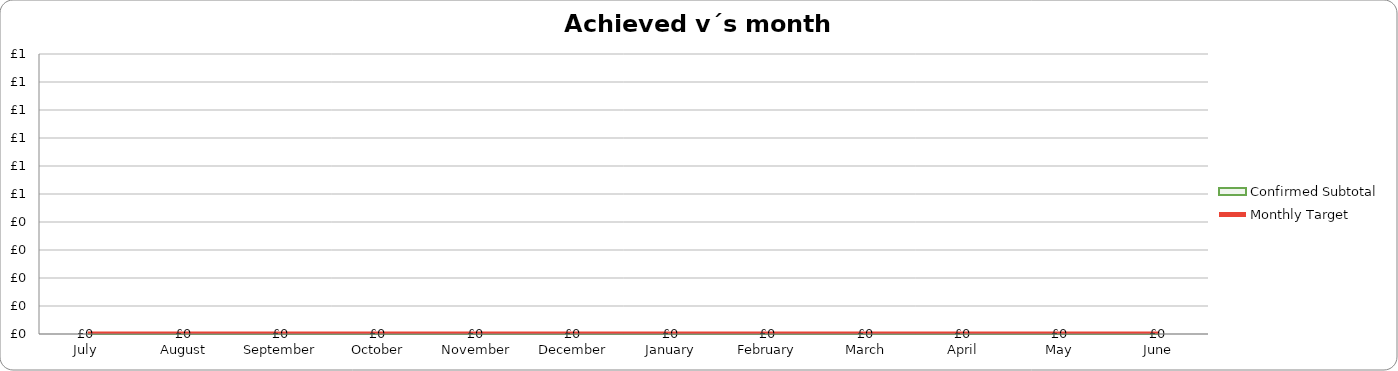
| Category | Monthly Target |
|---|---|
| 2019-07-01 | 0 |
| 2019-08-01 | 0 |
| 2019-09-01 | 0 |
| 2019-10-01 | 0 |
| 2019-11-01 | 0 |
| 2019-12-01 | 0 |
| 2020-01-01 | 0 |
| 2020-02-01 | 0 |
| 2020-03-01 | 0 |
| 2020-04-01 | 0 |
| 2020-05-01 | 0 |
| 2020-06-01 | 0 |